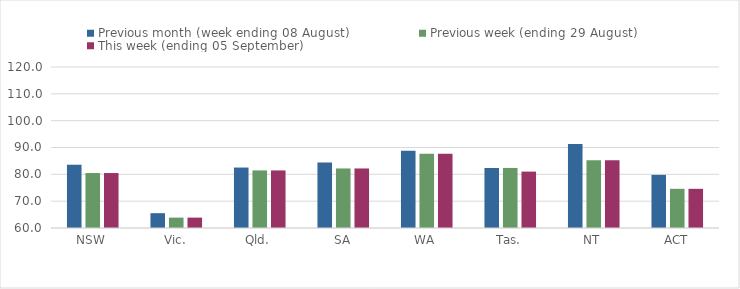
| Category | Previous month (week ending 08 August) | Previous week (ending 29 August) | This week (ending 05 September) |
|---|---|---|---|
| NSW | 83.58 | 80.48 | 80.48 |
| Vic. | 65.52 | 63.87 | 63.87 |
| Qld. | 82.53 | 81.46 | 81.46 |
| SA | 84.38 | 82.19 | 82.19 |
| WA | 88.78 | 87.64 | 87.64 |
| Tas. | 82.36 | 82.38 | 81.02 |
| NT | 91.33 | 85.28 | 85.28 |
| ACT | 79.8 | 74.6 | 74.6 |